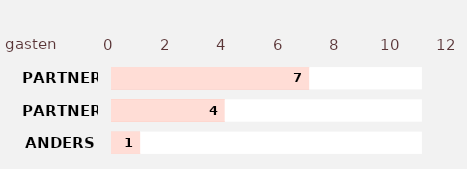
| Category | Series 2 | Series 3 | Series 1 | Series 0 |
|---|---|---|---|---|
| ANDERS | 11 | 1 | 11 | 1 |
| PARTNER 2 | 11 | 4 | 11 | 4 |
| PARTNER 1 | 11 | 7 | 11 | 7 |